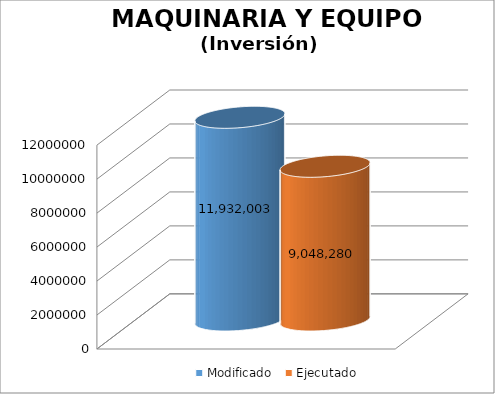
| Category | Modificado | Ejecutado |
|---|---|---|
| 0 | 11932003 | 9048279.97 |